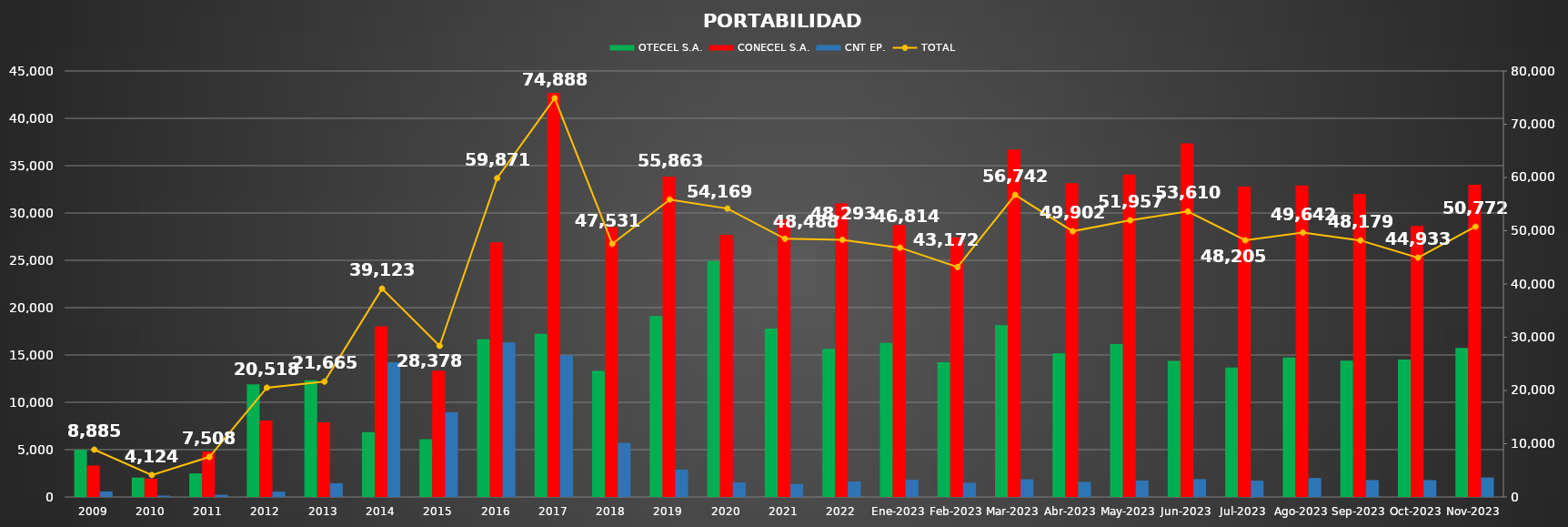
| Category | OTECEL S.A. | CONECEL S.A. | CNT EP. |
|---|---|---|---|
| 2009 | 4973 | 3324 | 588 |
| 2010 | 2045 | 1939 | 140 |
| 2011 | 2484 | 4796 | 228 |
| 2012 | 11894 | 8067 | 557 |
| 2013 | 12323 | 7893 | 1449 |
| 2014 | 6853 | 18039 | 14231 |
| 2015 | 6105 | 13334 | 8939 |
| 2016 | 16653 | 26907 | 16311 |
| 2017 | 17228 | 42694 | 14966 |
| 2018 | 13309 | 28504 | 5718 |
| 2019 | 19116 | 33857 | 2890 |
| 2020 | 24933 | 27700 | 1536 |
| 2021 | 17795 | 29321 | 1372 |
| 2022 | 15655 | 31012 | 1626 |
| Ene-2023 | 16278 | 28730 | 1806 |
| Feb-2023 | 14237 | 27438 | 1497 |
| Mar-2023 | 18159 | 36713 | 1870 |
| Abr-2023 | 15167 | 33140 | 1595 |
| May-2023 | 16147 | 34074 | 1736 |
| Jun-2023 | 14369 | 37353 | 1888 |
| Jul-2023 | 13685 | 32795 | 1725 |
| Ago-2023 | 14739 | 32898 | 2005 |
| Sep-2023 | 14396 | 31999 | 1784 |
| Oct-2023 | 14528 | 28619 | 1786 |
| Nov-2023 | 15737 | 32978 | 2057 |